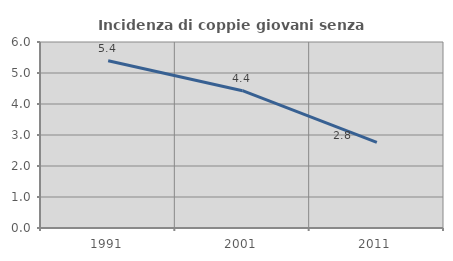
| Category | Incidenza di coppie giovani senza figli |
|---|---|
| 1991.0 | 5.398 |
| 2001.0 | 4.43 |
| 2011.0 | 2.76 |